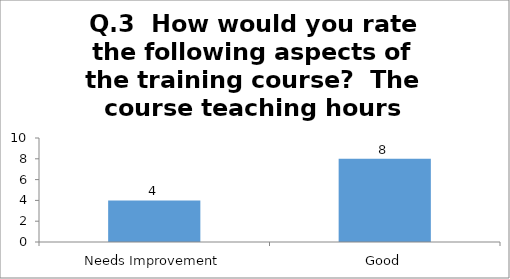
| Category | Q.3  How would you rate the following aspects of the training course?  The Course teaching hours |
|---|---|
| Needs Improvement | 4 |
| Good | 8 |